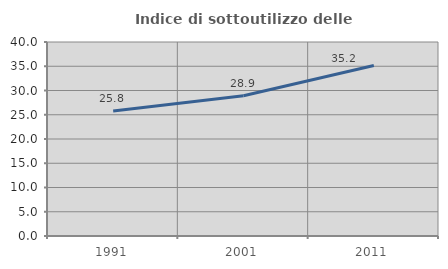
| Category | Indice di sottoutilizzo delle abitazioni  |
|---|---|
| 1991.0 | 25.767 |
| 2001.0 | 28.902 |
| 2011.0 | 35.169 |